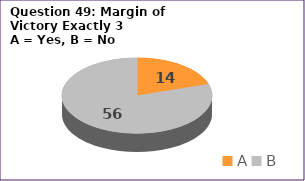
| Category | Series 0 |
|---|---|
| A | 14 |
| B | 56 |